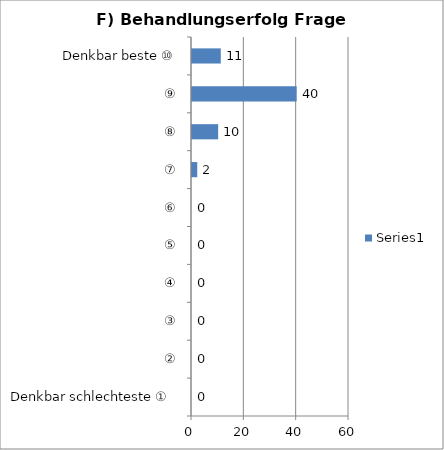
| Category | Series 0 |
|---|---|
| Denkbar schlechteste ①  | 0 |
| ② | 0 |
| ③ | 0 |
| ④ | 0 |
| ⑤ | 0 |
| ⑥ | 0 |
| ⑦ | 2 |
| ⑧ | 10 |
| ⑨ | 40 |
| Denkbar beste ⑩ | 11 |